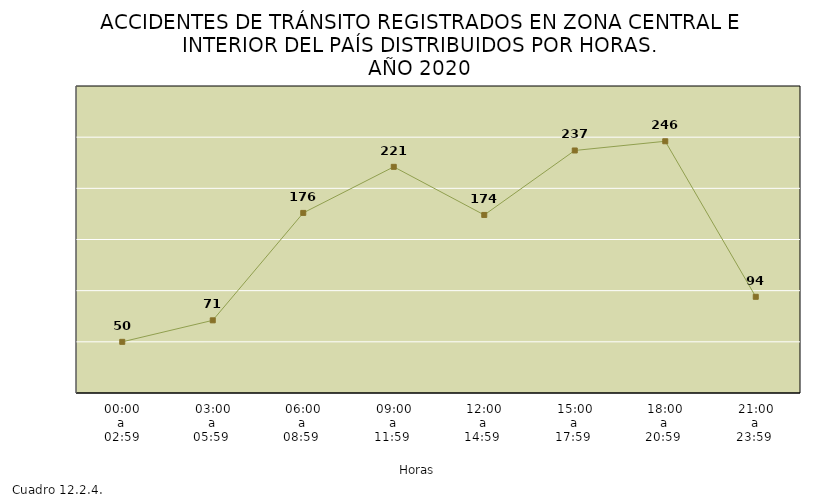
| Category | Total |
|---|---|
| 00:00
a
02:59 | 50 |
| 03:00
a
05:59  | 71 |
| 06:00
a
08:59  | 176 |
| 09:00
a
11:59  | 221 |
| 12:00
a
14:59  | 174 |
| 15:00
a
17:59  | 237 |
| 18:00
a
20:59  | 246 |
| 21:00
a
23:59  | 94 |